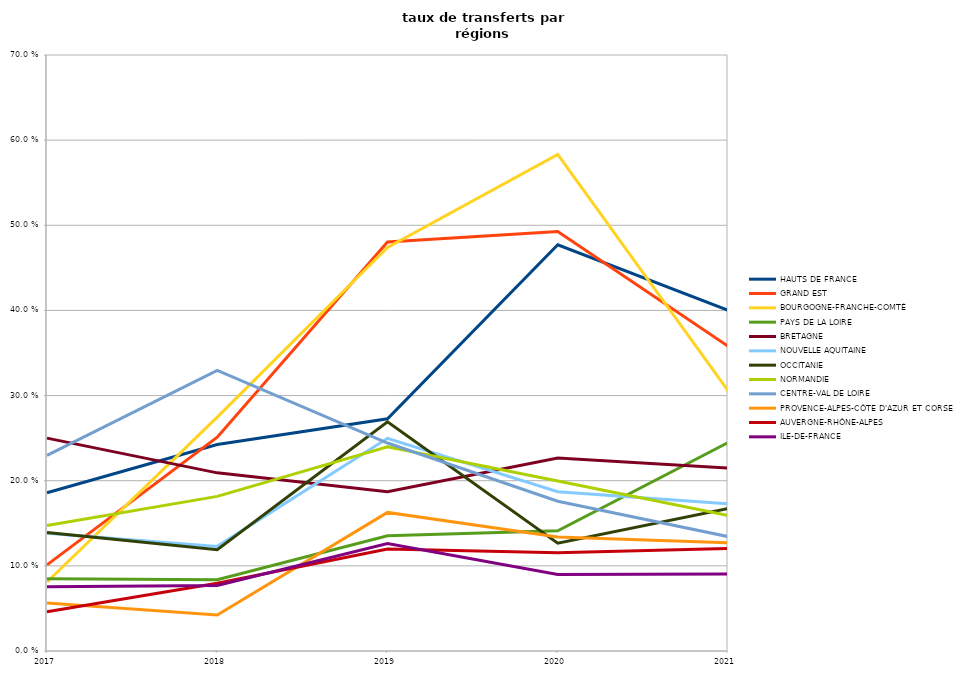
| Category | HAUTS DE FRANCE | GRAND EST | BOURGOGNE-FRANCHE-COMTÉ | PAYS DE LA LOIRE | BRETAGNE | NOUVELLE AQUITAINE | OCCITANIE | NORMANDIE | CENTRE-VAL DE LOIRE | PROVENCE-ALPES-CÔTE D'AZUR ET CORSE | AUVERGNE-RHÔNE-ALPES | ILE-DE-FRANCE |
|---|---|---|---|---|---|---|---|---|---|---|---|---|
| 2017 | 0.186 | 0.101 | 0.081 | 0.085 | 0.25 | 0.138 | 0.139 | 0.147 | 0.23 | 0.056 | 0.046 | 0.075 |
| 2018 | 0.243 | 0.251 | 0.275 | 0.084 | 0.209 | 0.123 | 0.119 | 0.182 | 0.33 | 0.042 | 0.08 | 0.077 |
| 2019 | 0.273 | 0.48 | 0.474 | 0.135 | 0.187 | 0.25 | 0.269 | 0.24 | 0.244 | 0.163 | 0.12 | 0.126 |
| 2020 | 0.477 | 0.493 | 0.583 | 0.141 | 0.227 | 0.187 | 0.127 | 0.2 | 0.176 | 0.134 | 0.115 | 0.09 |
| 2021 | 0.4 | 0.358 | 0.306 | 0.245 | 0.215 | 0.173 | 0.167 | 0.159 | 0.134 | 0.127 | 0.12 | 0.091 |